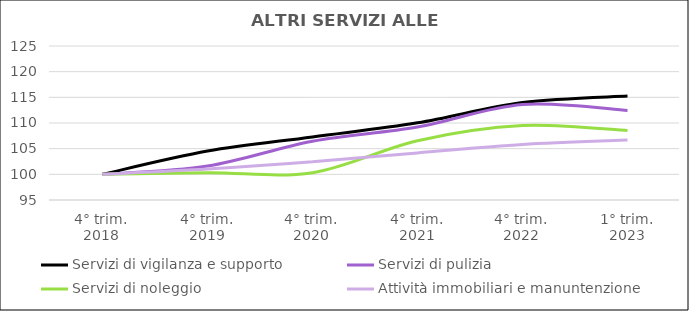
| Category | Servizi di vigilanza e supporto | Servizi di pulizia | Servizi di noleggio  | Attività immobiliari e manuntenzione  |
|---|---|---|---|---|
| 4° trim.
2018 | 100 | 100 | 100 | 100 |
| 4° trim.
2019 | 104.528 | 101.613 | 100.328 | 101.016 |
| 4° trim.
2020 | 107.283 | 106.452 | 100.328 | 102.436 |
| 4° trim.
2021 | 110.039 | 109.217 | 106.557 | 104.169 |
| 4° trim.
2022 | 113.976 | 113.594 | 109.508 | 105.813 |
| 1° trim.
2023 | 115.256 | 112.442 | 108.525 | 106.68 |